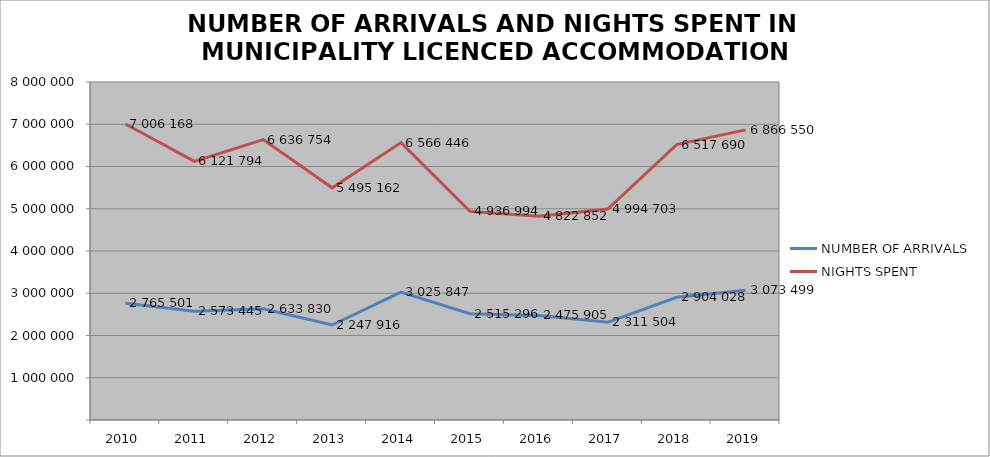
| Category | NUMBER OF ARRIVALS | NIGHTS SPENT |
|---|---|---|
| 2010 | 2765501 | 7006168 |
| 2011 | 2573445 | 6121794 |
| 2012 | 2633830 | 6636754 |
| 2013 | 2247916 | 5495162 |
| 2014 | 3025847 | 6566446 |
| 2015 | 2515296 | 4936994 |
| 2016 | 2475905 | 4822852 |
| 2017 | 2311504 | 4994703 |
| 2018 | 2904028 | 6517690 |
| 2019 | 3073499 | 6866550 |